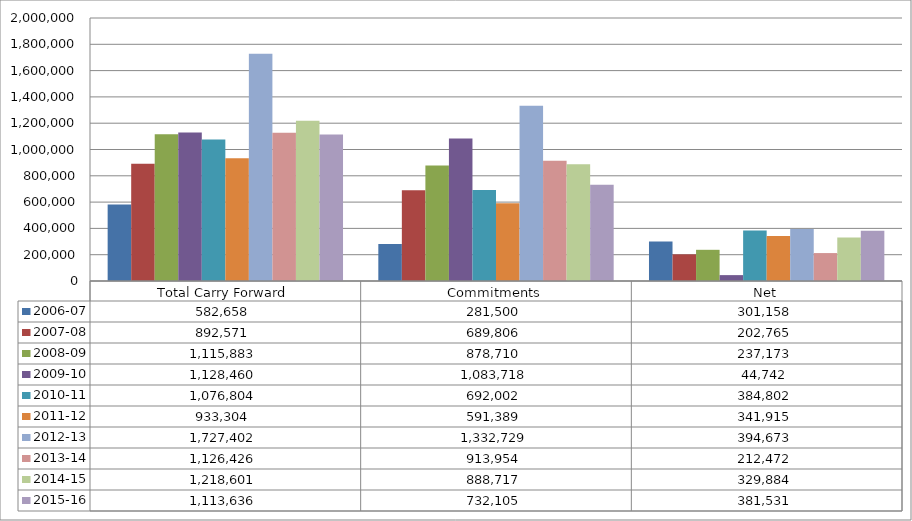
| Category | 2006-07 | 2007-08 | 2008-09 | 2009-10 | 2010-11 | 2011-12 | 2012-13 | 2013-14 | 2014-15 | 2015-16 |
|---|---|---|---|---|---|---|---|---|---|---|
| Total Carry Forward | 582658.09 | 892571 | 1115883.18 | 1128460.26 | 1076804 | 933304 | 1727402 | 1126426 | 1218601.36 | 1113636.39 |
| Commitments | 281500 | 689806 | 878710 | 1083718 | 692002 | 591389 | 1332729 | 913954 | 888717 | 732105 |
| Net | 301158.09 | 202765 | 237173.18 | 44742.26 | 384802 | 341915 | 394673 | 212472 | 329884.36 | 381531.39 |